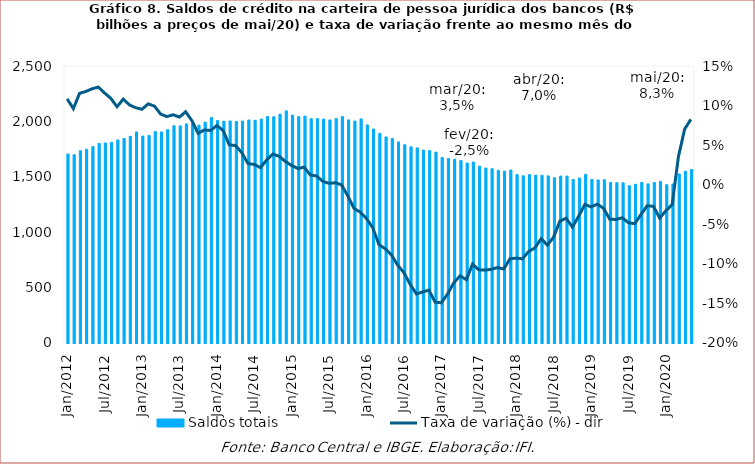
| Category | Saldos totais |
|---|---|
| 2012-01-01 | 1705580.329 |
| 2012-02-01 | 1699263.295 |
| 2012-03-01 | 1735509.615 |
| 2012-04-01 | 1748967.678 |
| 2012-05-01 | 1772462.532 |
| 2012-06-01 | 1801192.179 |
| 2012-07-01 | 1805180.433 |
| 2012-08-01 | 1810825.521 |
| 2012-09-01 | 1832922.73 |
| 2012-10-01 | 1846009.546 |
| 2012-11-01 | 1864467.586 |
| 2012-12-01 | 1904794.321 |
| 2013-01-01 | 1868120.684 |
| 2013-02-01 | 1872865.086 |
| 2013-03-01 | 1907819.911 |
| 2013-04-01 | 1904941.046 |
| 2013-05-01 | 1925162.848 |
| 2013-06-01 | 1960409.84 |
| 2013-07-01 | 1959354.269 |
| 2013-08-01 | 1977823.552 |
| 2013-09-01 | 1981354.453 |
| 2013-10-01 | 1965943.327 |
| 2013-11-01 | 1993497.463 |
| 2013-12-01 | 2035342.911 |
| 2014-01-01 | 2007796.971 |
| 2014-02-01 | 2001330.561 |
| 2014-03-01 | 2003850.136 |
| 2014-04-01 | 1999260.667 |
| 2014-05-01 | 2003151.737 |
| 2014-06-01 | 2012639.943 |
| 2014-07-01 | 2009665.847 |
| 2014-08-01 | 2020381.617 |
| 2014-09-01 | 2043571.379 |
| 2014-10-01 | 2042316.172 |
| 2014-11-01 | 2064888.049 |
| 2014-12-01 | 2095153.159 |
| 2015-01-01 | 2056515.234 |
| 2015-02-01 | 2042435.739 |
| 2015-03-01 | 2048263.905 |
| 2015-04-01 | 2023824.496 |
| 2015-05-01 | 2025208.464 |
| 2015-06-01 | 2021061.389 |
| 2015-07-01 | 2013087.562 |
| 2015-08-01 | 2025353.353 |
| 2015-09-01 | 2043193.438 |
| 2015-10-01 | 2013481.781 |
| 2015-11-01 | 2003148.897 |
| 2015-12-01 | 2022575.676 |
| 2016-01-01 | 1968390.985 |
| 2016-02-01 | 1931455.872 |
| 2016-03-01 | 1892995.007 |
| 2016-04-01 | 1859971.162 |
| 2016-05-01 | 1845569.531 |
| 2016-06-01 | 1815349.358 |
| 2016-07-01 | 1789152.453 |
| 2016-08-01 | 1770355.629 |
| 2016-09-01 | 1761110.363 |
| 2016-10-01 | 1740704.569 |
| 2016-11-01 | 1736153.937 |
| 2016-12-01 | 1722440.734 |
| 2017-01-01 | 1674857.531 |
| 2017-02-01 | 1664864.841 |
| 2017-03-01 | 1658798.786 |
| 2017-04-01 | 1645757.401 |
| 2017-05-01 | 1624172.309 |
| 2017-06-01 | 1633302.669 |
| 2017-07-01 | 1596670.671 |
| 2017-08-01 | 1579307.09 |
| 2017-09-01 | 1572929.53 |
| 2017-10-01 | 1558477.556 |
| 2017-11-01 | 1551053.192 |
| 2017-12-01 | 1561274.797 |
| 2018-01-01 | 1519543.498 |
| 2018-02-01 | 1509033.698 |
| 2018-03-01 | 1518898.34 |
| 2018-04-01 | 1514468.545 |
| 2018-05-01 | 1513455.971 |
| 2018-06-01 | 1508601.64 |
| 2018-07-01 | 1491216.737 |
| 2018-08-01 | 1506677.628 |
| 2018-09-01 | 1506251.81 |
| 2018-10-01 | 1475076.726 |
| 2018-11-01 | 1488978.05 |
| 2018-12-01 | 1522393.009 |
| 2019-01-01 | 1476993.154 |
| 2019-02-01 | 1471927.981 |
| 2019-03-01 | 1473625.933 |
| 2019-04-01 | 1448413.053 |
| 2019-05-01 | 1447020.298 |
| 2019-06-01 | 1445547.639 |
| 2019-07-01 | 1419564.791 |
| 2019-08-01 | 1432468.601 |
| 2019-09-01 | 1449551.789 |
| 2019-10-01 | 1435950.3 |
| 2019-11-01 | 1448306.642 |
| 2019-12-01 | 1458116.189 |
| 2020-01-01 | 1428571.845 |
| 2020-02-01 | 1434833.711 |
| 2020-03-01 | 1525639.624 |
| 2020-04-01 | 1550208.107 |
| 2020-05-01 | 1566529 |